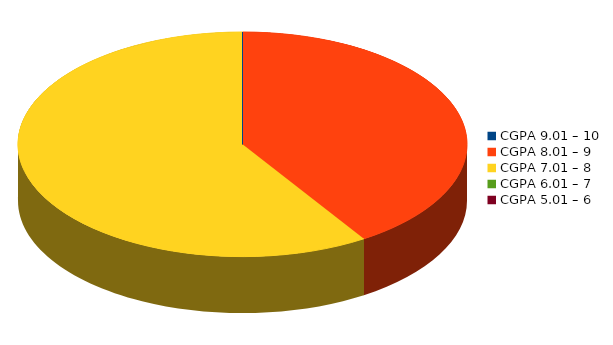
| Category | Number of students |
|---|---|
| CGPA 9.01 – 10 | 0 |
| CGPA 8.01 – 9 | 9 |
| CGPA 7.01 – 8 | 13 |
| CGPA 6.01 – 7 | 0 |
| CGPA 5.01 – 6 | 0 |